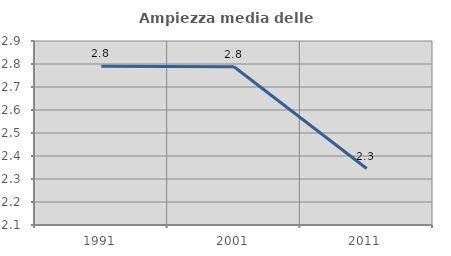
| Category | Ampiezza media delle famiglie |
|---|---|
| 1991.0 | 2.791 |
| 2001.0 | 2.788 |
| 2011.0 | 2.346 |